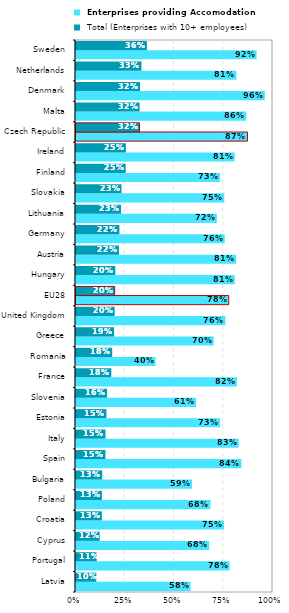
| Category |  Enterprises providing Accomodation |  Total (Enterprises with 10+ employees) |
|---|---|---|
| Latvia | 0.581 | 0.103 |
| Portugal | 0.78 | 0.105 |
| Cyprus | 0.676 | 0.12 |
| Croatia | 0.752 | 0.131 |
| Poland | 0.683 | 0.131 |
| Bulgaria | 0.589 | 0.133 |
| Spain | 0.84 | 0.149 |
| Italy | 0.826 | 0.15 |
| Estonia | 0.731 | 0.154 |
| Slovenia | 0.609 | 0.158 |
| France | 0.817 | 0.179 |
| Romania | 0.404 | 0.184 |
| Greece | 0.699 | 0.193 |
| United Kingdom | 0.758 | 0.196 |
| EU28 | 0.775 | 0.196 |
| Hungary | 0.806 | 0.199 |
| Austria | 0.813 | 0.218 |
| Germany | 0.755 | 0.22 |
| Lithuania | 0.715 | 0.229 |
| Slovakia | 0.753 | 0.231 |
| Finland | 0.731 | 0.252 |
| Ireland | 0.806 | 0.253 |
| Czech Republic | 0.87 | 0.323 |
| Malta | 0.864 | 0.323 |
| Denmark | 0.958 | 0.325 |
| Netherlands | 0.814 | 0.332 |
| Sweden | 0.917 | 0.36 |